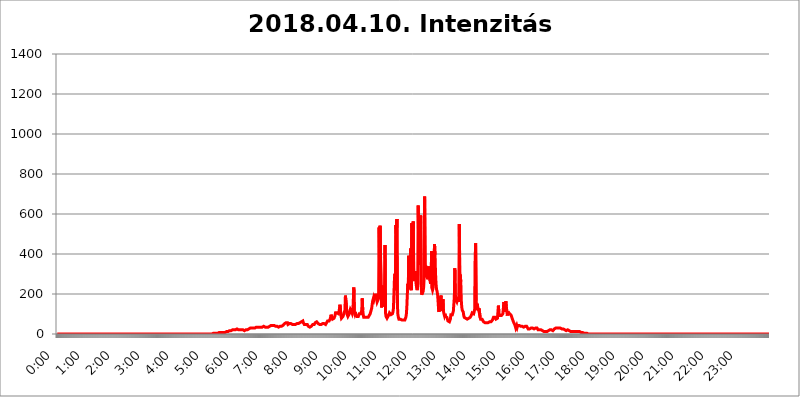
| Category | 2018.04.10. Intenzitás [W/m^2] |
|---|---|
| 0.0 | 0 |
| 0.0006944444444444445 | 0 |
| 0.001388888888888889 | 0 |
| 0.0020833333333333333 | 0 |
| 0.002777777777777778 | 0 |
| 0.003472222222222222 | 0 |
| 0.004166666666666667 | 0 |
| 0.004861111111111111 | 0 |
| 0.005555555555555556 | 0 |
| 0.0062499999999999995 | 0 |
| 0.006944444444444444 | 0 |
| 0.007638888888888889 | 0 |
| 0.008333333333333333 | 0 |
| 0.009027777777777779 | 0 |
| 0.009722222222222222 | 0 |
| 0.010416666666666666 | 0 |
| 0.011111111111111112 | 0 |
| 0.011805555555555555 | 0 |
| 0.012499999999999999 | 0 |
| 0.013194444444444444 | 0 |
| 0.013888888888888888 | 0 |
| 0.014583333333333332 | 0 |
| 0.015277777777777777 | 0 |
| 0.015972222222222224 | 0 |
| 0.016666666666666666 | 0 |
| 0.017361111111111112 | 0 |
| 0.018055555555555557 | 0 |
| 0.01875 | 0 |
| 0.019444444444444445 | 0 |
| 0.02013888888888889 | 0 |
| 0.020833333333333332 | 0 |
| 0.02152777777777778 | 0 |
| 0.022222222222222223 | 0 |
| 0.02291666666666667 | 0 |
| 0.02361111111111111 | 0 |
| 0.024305555555555556 | 0 |
| 0.024999999999999998 | 0 |
| 0.025694444444444447 | 0 |
| 0.02638888888888889 | 0 |
| 0.027083333333333334 | 0 |
| 0.027777777777777776 | 0 |
| 0.02847222222222222 | 0 |
| 0.029166666666666664 | 0 |
| 0.029861111111111113 | 0 |
| 0.030555555555555555 | 0 |
| 0.03125 | 0 |
| 0.03194444444444445 | 0 |
| 0.03263888888888889 | 0 |
| 0.03333333333333333 | 0 |
| 0.034027777777777775 | 0 |
| 0.034722222222222224 | 0 |
| 0.035416666666666666 | 0 |
| 0.036111111111111115 | 0 |
| 0.03680555555555556 | 0 |
| 0.0375 | 0 |
| 0.03819444444444444 | 0 |
| 0.03888888888888889 | 0 |
| 0.03958333333333333 | 0 |
| 0.04027777777777778 | 0 |
| 0.04097222222222222 | 0 |
| 0.041666666666666664 | 0 |
| 0.042361111111111106 | 0 |
| 0.04305555555555556 | 0 |
| 0.043750000000000004 | 0 |
| 0.044444444444444446 | 0 |
| 0.04513888888888889 | 0 |
| 0.04583333333333334 | 0 |
| 0.04652777777777778 | 0 |
| 0.04722222222222222 | 0 |
| 0.04791666666666666 | 0 |
| 0.04861111111111111 | 0 |
| 0.049305555555555554 | 0 |
| 0.049999999999999996 | 0 |
| 0.05069444444444445 | 0 |
| 0.051388888888888894 | 0 |
| 0.052083333333333336 | 0 |
| 0.05277777777777778 | 0 |
| 0.05347222222222222 | 0 |
| 0.05416666666666667 | 0 |
| 0.05486111111111111 | 0 |
| 0.05555555555555555 | 0 |
| 0.05625 | 0 |
| 0.05694444444444444 | 0 |
| 0.057638888888888885 | 0 |
| 0.05833333333333333 | 0 |
| 0.05902777777777778 | 0 |
| 0.059722222222222225 | 0 |
| 0.06041666666666667 | 0 |
| 0.061111111111111116 | 0 |
| 0.06180555555555556 | 0 |
| 0.0625 | 0 |
| 0.06319444444444444 | 0 |
| 0.06388888888888888 | 0 |
| 0.06458333333333334 | 0 |
| 0.06527777777777778 | 0 |
| 0.06597222222222222 | 0 |
| 0.06666666666666667 | 0 |
| 0.06736111111111111 | 0 |
| 0.06805555555555555 | 0 |
| 0.06874999999999999 | 0 |
| 0.06944444444444443 | 0 |
| 0.07013888888888889 | 0 |
| 0.07083333333333333 | 0 |
| 0.07152777777777779 | 0 |
| 0.07222222222222223 | 0 |
| 0.07291666666666667 | 0 |
| 0.07361111111111111 | 0 |
| 0.07430555555555556 | 0 |
| 0.075 | 0 |
| 0.07569444444444444 | 0 |
| 0.0763888888888889 | 0 |
| 0.07708333333333334 | 0 |
| 0.07777777777777778 | 0 |
| 0.07847222222222222 | 0 |
| 0.07916666666666666 | 0 |
| 0.0798611111111111 | 0 |
| 0.08055555555555556 | 0 |
| 0.08125 | 0 |
| 0.08194444444444444 | 0 |
| 0.08263888888888889 | 0 |
| 0.08333333333333333 | 0 |
| 0.08402777777777777 | 0 |
| 0.08472222222222221 | 0 |
| 0.08541666666666665 | 0 |
| 0.08611111111111112 | 0 |
| 0.08680555555555557 | 0 |
| 0.08750000000000001 | 0 |
| 0.08819444444444445 | 0 |
| 0.08888888888888889 | 0 |
| 0.08958333333333333 | 0 |
| 0.09027777777777778 | 0 |
| 0.09097222222222222 | 0 |
| 0.09166666666666667 | 0 |
| 0.09236111111111112 | 0 |
| 0.09305555555555556 | 0 |
| 0.09375 | 0 |
| 0.09444444444444444 | 0 |
| 0.09513888888888888 | 0 |
| 0.09583333333333333 | 0 |
| 0.09652777777777777 | 0 |
| 0.09722222222222222 | 0 |
| 0.09791666666666667 | 0 |
| 0.09861111111111111 | 0 |
| 0.09930555555555555 | 0 |
| 0.09999999999999999 | 0 |
| 0.10069444444444443 | 0 |
| 0.1013888888888889 | 0 |
| 0.10208333333333335 | 0 |
| 0.10277777777777779 | 0 |
| 0.10347222222222223 | 0 |
| 0.10416666666666667 | 0 |
| 0.10486111111111111 | 0 |
| 0.10555555555555556 | 0 |
| 0.10625 | 0 |
| 0.10694444444444444 | 0 |
| 0.1076388888888889 | 0 |
| 0.10833333333333334 | 0 |
| 0.10902777777777778 | 0 |
| 0.10972222222222222 | 0 |
| 0.1111111111111111 | 0 |
| 0.11180555555555556 | 0 |
| 0.11180555555555556 | 0 |
| 0.1125 | 0 |
| 0.11319444444444444 | 0 |
| 0.11388888888888889 | 0 |
| 0.11458333333333333 | 0 |
| 0.11527777777777777 | 0 |
| 0.11597222222222221 | 0 |
| 0.11666666666666665 | 0 |
| 0.1173611111111111 | 0 |
| 0.11805555555555557 | 0 |
| 0.11944444444444445 | 0 |
| 0.12013888888888889 | 0 |
| 0.12083333333333333 | 0 |
| 0.12152777777777778 | 0 |
| 0.12222222222222223 | 0 |
| 0.12291666666666667 | 0 |
| 0.12291666666666667 | 0 |
| 0.12361111111111112 | 0 |
| 0.12430555555555556 | 0 |
| 0.125 | 0 |
| 0.12569444444444444 | 0 |
| 0.12638888888888888 | 0 |
| 0.12708333333333333 | 0 |
| 0.16875 | 0 |
| 0.12847222222222224 | 0 |
| 0.12916666666666668 | 0 |
| 0.12986111111111112 | 0 |
| 0.13055555555555556 | 0 |
| 0.13125 | 0 |
| 0.13194444444444445 | 0 |
| 0.1326388888888889 | 0 |
| 0.13333333333333333 | 0 |
| 0.13402777777777777 | 0 |
| 0.13402777777777777 | 0 |
| 0.13472222222222222 | 0 |
| 0.13541666666666666 | 0 |
| 0.1361111111111111 | 0 |
| 0.13749999999999998 | 0 |
| 0.13819444444444443 | 0 |
| 0.1388888888888889 | 0 |
| 0.13958333333333334 | 0 |
| 0.14027777777777778 | 0 |
| 0.14097222222222222 | 0 |
| 0.14166666666666666 | 0 |
| 0.1423611111111111 | 0 |
| 0.14305555555555557 | 0 |
| 0.14375000000000002 | 0 |
| 0.14444444444444446 | 0 |
| 0.1451388888888889 | 0 |
| 0.1451388888888889 | 0 |
| 0.14652777777777778 | 0 |
| 0.14722222222222223 | 0 |
| 0.14791666666666667 | 0 |
| 0.1486111111111111 | 0 |
| 0.14930555555555555 | 0 |
| 0.15 | 0 |
| 0.15069444444444444 | 0 |
| 0.15138888888888888 | 0 |
| 0.15208333333333332 | 0 |
| 0.15277777777777776 | 0 |
| 0.15347222222222223 | 0 |
| 0.15416666666666667 | 0 |
| 0.15486111111111112 | 0 |
| 0.15555555555555556 | 0 |
| 0.15625 | 0 |
| 0.15694444444444444 | 0 |
| 0.15763888888888888 | 0 |
| 0.15833333333333333 | 0 |
| 0.15902777777777777 | 0 |
| 0.15972222222222224 | 0 |
| 0.16041666666666668 | 0 |
| 0.16111111111111112 | 0 |
| 0.16180555555555556 | 0 |
| 0.1625 | 0 |
| 0.16319444444444445 | 0 |
| 0.1638888888888889 | 0 |
| 0.16458333333333333 | 0 |
| 0.16527777777777777 | 0 |
| 0.16597222222222222 | 0 |
| 0.16666666666666666 | 0 |
| 0.1673611111111111 | 0 |
| 0.16805555555555554 | 0 |
| 0.16874999999999998 | 0 |
| 0.16944444444444443 | 0 |
| 0.17013888888888887 | 0 |
| 0.1708333333333333 | 0 |
| 0.17152777777777775 | 0 |
| 0.17222222222222225 | 0 |
| 0.1729166666666667 | 0 |
| 0.17361111111111113 | 0 |
| 0.17430555555555557 | 0 |
| 0.17500000000000002 | 0 |
| 0.17569444444444446 | 0 |
| 0.1763888888888889 | 0 |
| 0.17708333333333334 | 0 |
| 0.17777777777777778 | 0 |
| 0.17847222222222223 | 0 |
| 0.17916666666666667 | 0 |
| 0.1798611111111111 | 0 |
| 0.18055555555555555 | 0 |
| 0.18125 | 0 |
| 0.18194444444444444 | 0 |
| 0.1826388888888889 | 0 |
| 0.18333333333333335 | 0 |
| 0.1840277777777778 | 0 |
| 0.18472222222222223 | 0 |
| 0.18541666666666667 | 0 |
| 0.18611111111111112 | 0 |
| 0.18680555555555556 | 0 |
| 0.1875 | 0 |
| 0.18819444444444444 | 0 |
| 0.18888888888888888 | 0 |
| 0.18958333333333333 | 0 |
| 0.19027777777777777 | 0 |
| 0.1909722222222222 | 0 |
| 0.19166666666666665 | 0 |
| 0.19236111111111112 | 0 |
| 0.19305555555555554 | 0 |
| 0.19375 | 0 |
| 0.19444444444444445 | 0 |
| 0.1951388888888889 | 0 |
| 0.19583333333333333 | 0 |
| 0.19652777777777777 | 0 |
| 0.19722222222222222 | 0 |
| 0.19791666666666666 | 0 |
| 0.1986111111111111 | 0 |
| 0.19930555555555554 | 0 |
| 0.19999999999999998 | 0 |
| 0.20069444444444443 | 0 |
| 0.20138888888888887 | 0 |
| 0.2020833333333333 | 0 |
| 0.2027777777777778 | 0 |
| 0.2034722222222222 | 0 |
| 0.2041666666666667 | 0 |
| 0.20486111111111113 | 0 |
| 0.20555555555555557 | 0 |
| 0.20625000000000002 | 0 |
| 0.20694444444444446 | 0 |
| 0.2076388888888889 | 0 |
| 0.20833333333333334 | 0 |
| 0.20902777777777778 | 0 |
| 0.20972222222222223 | 0 |
| 0.21041666666666667 | 0 |
| 0.2111111111111111 | 0 |
| 0.21180555555555555 | 0 |
| 0.2125 | 0 |
| 0.21319444444444444 | 0 |
| 0.2138888888888889 | 0 |
| 0.21458333333333335 | 0 |
| 0.2152777777777778 | 0 |
| 0.21597222222222223 | 0 |
| 0.21666666666666667 | 0 |
| 0.21736111111111112 | 0 |
| 0.21805555555555556 | 3.525 |
| 0.21875 | 3.525 |
| 0.21944444444444444 | 3.525 |
| 0.22013888888888888 | 3.525 |
| 0.22083333333333333 | 3.525 |
| 0.22152777777777777 | 3.525 |
| 0.2222222222222222 | 3.525 |
| 0.22291666666666665 | 3.525 |
| 0.2236111111111111 | 3.525 |
| 0.22430555555555556 | 3.525 |
| 0.225 | 3.525 |
| 0.22569444444444445 | 3.525 |
| 0.2263888888888889 | 3.525 |
| 0.22708333333333333 | 7.887 |
| 0.22777777777777777 | 3.525 |
| 0.22847222222222222 | 7.887 |
| 0.22916666666666666 | 7.887 |
| 0.2298611111111111 | 7.887 |
| 0.23055555555555554 | 7.887 |
| 0.23124999999999998 | 7.887 |
| 0.23194444444444443 | 7.887 |
| 0.23263888888888887 | 7.887 |
| 0.2333333333333333 | 7.887 |
| 0.2340277777777778 | 7.887 |
| 0.2347222222222222 | 12.257 |
| 0.2354166666666667 | 7.887 |
| 0.23611111111111113 | 7.887 |
| 0.23680555555555557 | 12.257 |
| 0.23750000000000002 | 12.257 |
| 0.23819444444444446 | 12.257 |
| 0.2388888888888889 | 12.257 |
| 0.23958333333333334 | 12.257 |
| 0.24027777777777778 | 12.257 |
| 0.24097222222222223 | 12.257 |
| 0.24166666666666667 | 16.636 |
| 0.2423611111111111 | 16.636 |
| 0.24305555555555555 | 16.636 |
| 0.24375 | 16.636 |
| 0.24444444444444446 | 16.636 |
| 0.24513888888888888 | 21.024 |
| 0.24583333333333335 | 21.024 |
| 0.2465277777777778 | 21.024 |
| 0.24722222222222223 | 21.024 |
| 0.24791666666666667 | 21.024 |
| 0.24861111111111112 | 21.024 |
| 0.24930555555555556 | 21.024 |
| 0.25 | 21.024 |
| 0.25069444444444444 | 21.024 |
| 0.2513888888888889 | 21.024 |
| 0.2520833333333333 | 25.419 |
| 0.25277777777777777 | 21.024 |
| 0.2534722222222222 | 21.024 |
| 0.25416666666666665 | 21.024 |
| 0.2548611111111111 | 21.024 |
| 0.2555555555555556 | 21.024 |
| 0.25625000000000003 | 21.024 |
| 0.2569444444444445 | 21.024 |
| 0.2576388888888889 | 21.024 |
| 0.25833333333333336 | 21.024 |
| 0.2590277777777778 | 21.024 |
| 0.25972222222222224 | 21.024 |
| 0.2604166666666667 | 21.024 |
| 0.2611111111111111 | 21.024 |
| 0.26180555555555557 | 16.636 |
| 0.2625 | 16.636 |
| 0.26319444444444445 | 21.024 |
| 0.2638888888888889 | 16.636 |
| 0.26458333333333334 | 21.024 |
| 0.2652777777777778 | 21.024 |
| 0.2659722222222222 | 21.024 |
| 0.26666666666666666 | 21.024 |
| 0.2673611111111111 | 21.024 |
| 0.26805555555555555 | 25.419 |
| 0.26875 | 25.419 |
| 0.26944444444444443 | 25.419 |
| 0.2701388888888889 | 29.823 |
| 0.2708333333333333 | 29.823 |
| 0.27152777777777776 | 29.823 |
| 0.2722222222222222 | 29.823 |
| 0.27291666666666664 | 29.823 |
| 0.2736111111111111 | 29.823 |
| 0.2743055555555555 | 29.823 |
| 0.27499999999999997 | 29.823 |
| 0.27569444444444446 | 29.823 |
| 0.27638888888888885 | 29.823 |
| 0.27708333333333335 | 29.823 |
| 0.2777777777777778 | 29.823 |
| 0.27847222222222223 | 29.823 |
| 0.2791666666666667 | 34.234 |
| 0.2798611111111111 | 29.823 |
| 0.28055555555555556 | 34.234 |
| 0.28125 | 34.234 |
| 0.28194444444444444 | 34.234 |
| 0.2826388888888889 | 34.234 |
| 0.2833333333333333 | 34.234 |
| 0.28402777777777777 | 34.234 |
| 0.2847222222222222 | 34.234 |
| 0.28541666666666665 | 34.234 |
| 0.28611111111111115 | 34.234 |
| 0.28680555555555554 | 34.234 |
| 0.28750000000000003 | 34.234 |
| 0.2881944444444445 | 38.653 |
| 0.2888888888888889 | 38.653 |
| 0.28958333333333336 | 38.653 |
| 0.2902777777777778 | 38.653 |
| 0.29097222222222224 | 38.653 |
| 0.2916666666666667 | 34.234 |
| 0.2923611111111111 | 34.234 |
| 0.29305555555555557 | 34.234 |
| 0.29375 | 34.234 |
| 0.29444444444444445 | 34.234 |
| 0.2951388888888889 | 34.234 |
| 0.29583333333333334 | 34.234 |
| 0.2965277777777778 | 34.234 |
| 0.2972222222222222 | 34.234 |
| 0.29791666666666666 | 38.653 |
| 0.2986111111111111 | 38.653 |
| 0.29930555555555555 | 38.653 |
| 0.3 | 43.079 |
| 0.30069444444444443 | 43.079 |
| 0.3013888888888889 | 43.079 |
| 0.3020833333333333 | 43.079 |
| 0.30277777777777776 | 43.079 |
| 0.3034722222222222 | 43.079 |
| 0.30416666666666664 | 43.079 |
| 0.3048611111111111 | 38.653 |
| 0.3055555555555555 | 38.653 |
| 0.30624999999999997 | 38.653 |
| 0.3069444444444444 | 38.653 |
| 0.3076388888888889 | 38.653 |
| 0.30833333333333335 | 38.653 |
| 0.3090277777777778 | 38.653 |
| 0.30972222222222223 | 34.234 |
| 0.3104166666666667 | 34.234 |
| 0.3111111111111111 | 34.234 |
| 0.31180555555555556 | 34.234 |
| 0.3125 | 38.653 |
| 0.31319444444444444 | 38.653 |
| 0.3138888888888889 | 38.653 |
| 0.3145833333333333 | 38.653 |
| 0.31527777777777777 | 38.653 |
| 0.3159722222222222 | 43.079 |
| 0.31666666666666665 | 43.079 |
| 0.31736111111111115 | 47.511 |
| 0.31805555555555554 | 47.511 |
| 0.31875000000000003 | 51.951 |
| 0.3194444444444445 | 51.951 |
| 0.3201388888888889 | 51.951 |
| 0.32083333333333336 | 56.398 |
| 0.3215277777777778 | 51.951 |
| 0.32222222222222224 | 51.951 |
| 0.3229166666666667 | 56.398 |
| 0.3236111111111111 | 47.511 |
| 0.32430555555555557 | 47.511 |
| 0.325 | 47.511 |
| 0.32569444444444445 | 51.951 |
| 0.3263888888888889 | 51.951 |
| 0.32708333333333334 | 51.951 |
| 0.3277777777777778 | 51.951 |
| 0.3284722222222222 | 51.951 |
| 0.32916666666666666 | 51.951 |
| 0.3298611111111111 | 47.511 |
| 0.33055555555555555 | 47.511 |
| 0.33125 | 47.511 |
| 0.33194444444444443 | 47.511 |
| 0.3326388888888889 | 47.511 |
| 0.3333333333333333 | 47.511 |
| 0.3340277777777778 | 47.511 |
| 0.3347222222222222 | 47.511 |
| 0.3354166666666667 | 51.951 |
| 0.3361111111111111 | 51.951 |
| 0.3368055555555556 | 51.951 |
| 0.33749999999999997 | 51.951 |
| 0.33819444444444446 | 51.951 |
| 0.33888888888888885 | 56.398 |
| 0.33958333333333335 | 56.398 |
| 0.34027777777777773 | 56.398 |
| 0.34097222222222223 | 56.398 |
| 0.3416666666666666 | 60.85 |
| 0.3423611111111111 | 60.85 |
| 0.3430555555555555 | 60.85 |
| 0.34375 | 60.85 |
| 0.3444444444444445 | 65.31 |
| 0.3451388888888889 | 56.398 |
| 0.3458333333333334 | 51.951 |
| 0.34652777777777777 | 47.511 |
| 0.34722222222222227 | 47.511 |
| 0.34791666666666665 | 47.511 |
| 0.34861111111111115 | 47.511 |
| 0.34930555555555554 | 47.511 |
| 0.35000000000000003 | 47.511 |
| 0.3506944444444444 | 47.511 |
| 0.3513888888888889 | 43.079 |
| 0.3520833333333333 | 38.653 |
| 0.3527777777777778 | 34.234 |
| 0.3534722222222222 | 34.234 |
| 0.3541666666666667 | 34.234 |
| 0.3548611111111111 | 34.234 |
| 0.35555555555555557 | 38.653 |
| 0.35625 | 38.653 |
| 0.35694444444444445 | 38.653 |
| 0.3576388888888889 | 43.079 |
| 0.35833333333333334 | 47.511 |
| 0.3590277777777778 | 47.511 |
| 0.3597222222222222 | 47.511 |
| 0.36041666666666666 | 47.511 |
| 0.3611111111111111 | 51.951 |
| 0.36180555555555555 | 56.398 |
| 0.3625 | 60.85 |
| 0.36319444444444443 | 60.85 |
| 0.3638888888888889 | 60.85 |
| 0.3645833333333333 | 60.85 |
| 0.3652777777777778 | 56.398 |
| 0.3659722222222222 | 51.951 |
| 0.3666666666666667 | 47.511 |
| 0.3673611111111111 | 47.511 |
| 0.3680555555555556 | 47.511 |
| 0.36874999999999997 | 47.511 |
| 0.36944444444444446 | 47.511 |
| 0.37013888888888885 | 47.511 |
| 0.37083333333333335 | 51.951 |
| 0.37152777777777773 | 51.951 |
| 0.37222222222222223 | 51.951 |
| 0.3729166666666666 | 51.951 |
| 0.3736111111111111 | 51.951 |
| 0.3743055555555555 | 51.951 |
| 0.375 | 51.951 |
| 0.3756944444444445 | 47.511 |
| 0.3763888888888889 | 47.511 |
| 0.3770833333333334 | 51.951 |
| 0.37777777777777777 | 56.398 |
| 0.37847222222222227 | 60.85 |
| 0.37916666666666665 | 65.31 |
| 0.37986111111111115 | 65.31 |
| 0.38055555555555554 | 65.31 |
| 0.38125000000000003 | 65.31 |
| 0.3819444444444444 | 69.775 |
| 0.3826388888888889 | 74.246 |
| 0.3833333333333333 | 83.205 |
| 0.3840277777777778 | 96.682 |
| 0.3847222222222222 | 87.692 |
| 0.3854166666666667 | 83.205 |
| 0.3861111111111111 | 74.246 |
| 0.38680555555555557 | 74.246 |
| 0.3875 | 74.246 |
| 0.38819444444444445 | 78.722 |
| 0.3888888888888889 | 83.205 |
| 0.38958333333333334 | 92.184 |
| 0.3902777777777778 | 105.69 |
| 0.3909722222222222 | 101.184 |
| 0.39166666666666666 | 101.184 |
| 0.3923611111111111 | 105.69 |
| 0.39305555555555555 | 105.69 |
| 0.39375 | 101.184 |
| 0.39444444444444443 | 101.184 |
| 0.3951388888888889 | 110.201 |
| 0.3958333333333333 | 128.284 |
| 0.3965277777777778 | 146.423 |
| 0.3972222222222222 | 123.758 |
| 0.3979166666666667 | 92.184 |
| 0.3986111111111111 | 78.722 |
| 0.3993055555555556 | 74.246 |
| 0.39999999999999997 | 78.722 |
| 0.40069444444444446 | 87.692 |
| 0.40138888888888885 | 92.184 |
| 0.40208333333333335 | 101.184 |
| 0.40277777777777773 | 110.201 |
| 0.40347222222222223 | 119.235 |
| 0.4041666666666666 | 191.937 |
| 0.4048611111111111 | 196.497 |
| 0.4055555555555555 | 141.884 |
| 0.40625 | 101.184 |
| 0.4069444444444445 | 101.184 |
| 0.4076388888888889 | 87.692 |
| 0.4083333333333334 | 87.692 |
| 0.40902777777777777 | 92.184 |
| 0.40972222222222227 | 101.184 |
| 0.41041666666666665 | 114.716 |
| 0.41111111111111115 | 123.758 |
| 0.41180555555555554 | 119.235 |
| 0.41250000000000003 | 114.716 |
| 0.4131944444444444 | 110.201 |
| 0.4138888888888889 | 101.184 |
| 0.4145833333333333 | 110.201 |
| 0.4152777777777778 | 114.716 |
| 0.4159722222222222 | 233 |
| 0.4166666666666667 | 110.201 |
| 0.4173611111111111 | 101.184 |
| 0.41805555555555557 | 110.201 |
| 0.41875 | 96.682 |
| 0.41944444444444445 | 92.184 |
| 0.4201388888888889 | 87.692 |
| 0.42083333333333334 | 83.205 |
| 0.4215277777777778 | 83.205 |
| 0.4222222222222222 | 87.692 |
| 0.42291666666666666 | 92.184 |
| 0.4236111111111111 | 101.184 |
| 0.42430555555555555 | 101.184 |
| 0.425 | 101.184 |
| 0.42569444444444443 | 101.184 |
| 0.4263888888888889 | 105.69 |
| 0.4270833333333333 | 119.235 |
| 0.4277777777777778 | 178.264 |
| 0.4284722222222222 | 119.235 |
| 0.4291666666666667 | 96.682 |
| 0.4298611111111111 | 83.205 |
| 0.4305555555555556 | 83.205 |
| 0.43124999999999997 | 83.205 |
| 0.43194444444444446 | 83.205 |
| 0.43263888888888885 | 83.205 |
| 0.43333333333333335 | 83.205 |
| 0.43402777777777773 | 83.205 |
| 0.43472222222222223 | 83.205 |
| 0.4354166666666666 | 83.205 |
| 0.4361111111111111 | 83.205 |
| 0.4368055555555555 | 83.205 |
| 0.4375 | 92.184 |
| 0.4381944444444445 | 96.682 |
| 0.4388888888888889 | 101.184 |
| 0.4395833333333334 | 110.201 |
| 0.44027777777777777 | 119.235 |
| 0.44097222222222227 | 128.284 |
| 0.44166666666666665 | 146.423 |
| 0.44236111111111115 | 164.605 |
| 0.44305555555555554 | 160.056 |
| 0.44375000000000003 | 182.82 |
| 0.4444444444444444 | 173.709 |
| 0.4451388888888889 | 173.709 |
| 0.4458333333333333 | 191.937 |
| 0.4465277777777778 | 201.058 |
| 0.4472222222222222 | 182.82 |
| 0.4479166666666667 | 173.709 |
| 0.4486111111111111 | 160.056 |
| 0.44930555555555557 | 160.056 |
| 0.45 | 164.605 |
| 0.45069444444444445 | 178.264 |
| 0.4513888888888889 | 532.513 |
| 0.45208333333333334 | 342.162 |
| 0.4527777777777778 | 541.121 |
| 0.4534722222222222 | 378.224 |
| 0.45416666666666666 | 301.354 |
| 0.4548611111111111 | 132.814 |
| 0.45555555555555555 | 173.709 |
| 0.45625 | 191.937 |
| 0.45694444444444443 | 228.436 |
| 0.4576388888888889 | 242.127 |
| 0.4583333333333333 | 137.347 |
| 0.4590277777777778 | 228.436 |
| 0.4597222222222222 | 445.129 |
| 0.4604166666666667 | 105.69 |
| 0.4611111111111111 | 87.692 |
| 0.4618055555555556 | 83.205 |
| 0.46249999999999997 | 78.722 |
| 0.46319444444444446 | 83.205 |
| 0.46388888888888885 | 83.205 |
| 0.46458333333333335 | 92.184 |
| 0.46527777777777773 | 96.682 |
| 0.46597222222222223 | 105.69 |
| 0.4666666666666666 | 105.69 |
| 0.4673611111111111 | 101.184 |
| 0.4680555555555555 | 96.682 |
| 0.46875 | 92.184 |
| 0.4694444444444445 | 96.682 |
| 0.4701388888888889 | 101.184 |
| 0.4708333333333334 | 110.201 |
| 0.47152777777777777 | 128.284 |
| 0.47222222222222227 | 201.058 |
| 0.47291666666666665 | 274.047 |
| 0.47361111111111115 | 301.354 |
| 0.47430555555555554 | 219.309 |
| 0.47500000000000003 | 545.416 |
| 0.4756944444444444 | 497.836 |
| 0.4763888888888889 | 575.299 |
| 0.4770833333333333 | 146.423 |
| 0.4777777777777778 | 96.682 |
| 0.4784722222222222 | 83.205 |
| 0.4791666666666667 | 74.246 |
| 0.4798611111111111 | 74.246 |
| 0.48055555555555557 | 69.775 |
| 0.48125 | 74.246 |
| 0.48194444444444445 | 69.775 |
| 0.4826388888888889 | 69.775 |
| 0.48333333333333334 | 69.775 |
| 0.4840277777777778 | 69.775 |
| 0.4847222222222222 | 69.775 |
| 0.48541666666666666 | 69.775 |
| 0.4861111111111111 | 69.775 |
| 0.48680555555555555 | 69.775 |
| 0.4875 | 69.775 |
| 0.48819444444444443 | 74.246 |
| 0.4888888888888889 | 83.205 |
| 0.4895833333333333 | 96.682 |
| 0.4902777777777778 | 132.814 |
| 0.4909722222222222 | 196.497 |
| 0.4916666666666667 | 251.251 |
| 0.4923611111111111 | 223.873 |
| 0.4930555555555556 | 391.685 |
| 0.49374999999999997 | 328.584 |
| 0.49444444444444446 | 328.584 |
| 0.49513888888888885 | 287.709 |
| 0.49583333333333335 | 427.39 |
| 0.49652777777777773 | 219.309 |
| 0.49722222222222223 | 553.986 |
| 0.4979166666666666 | 553.986 |
| 0.4986111111111111 | 515.223 |
| 0.4993055555555555 | 562.53 |
| 0.5 | 283.156 |
| 0.5006944444444444 | 278.603 |
| 0.5013888888888889 | 264.932 |
| 0.5020833333333333 | 314.98 |
| 0.5027777777777778 | 269.49 |
| 0.5034722222222222 | 246.689 |
| 0.5041666666666667 | 228.436 |
| 0.5048611111111111 | 219.309 |
| 0.5055555555555555 | 242.127 |
| 0.50625 | 642.4 |
| 0.5069444444444444 | 431.833 |
| 0.5076388888888889 | 562.53 |
| 0.5083333333333333 | 391.685 |
| 0.5090277777777777 | 346.682 |
| 0.5097222222222222 | 592.233 |
| 0.5104166666666666 | 246.689 |
| 0.5111111111111112 | 196.497 |
| 0.5118055555555555 | 191.937 |
| 0.5125000000000001 | 196.497 |
| 0.5131944444444444 | 214.746 |
| 0.513888888888889 | 233 |
| 0.5145833333333333 | 283.156 |
| 0.5152777777777778 | 687.544 |
| 0.5159722222222222 | 333.113 |
| 0.5166666666666667 | 342.162 |
| 0.517361111111111 | 310.44 |
| 0.5180555555555556 | 283.156 |
| 0.5187499999999999 | 314.98 |
| 0.5194444444444445 | 274.047 |
| 0.5201388888888888 | 274.047 |
| 0.5208333333333334 | 337.639 |
| 0.5215277777777778 | 301.354 |
| 0.5222222222222223 | 310.44 |
| 0.5229166666666667 | 264.932 |
| 0.5236111111111111 | 251.251 |
| 0.5243055555555556 | 274.047 |
| 0.525 | 414.035 |
| 0.5256944444444445 | 228.436 |
| 0.5263888888888889 | 219.309 |
| 0.5270833333333333 | 228.436 |
| 0.5277777777777778 | 251.251 |
| 0.5284722222222222 | 382.715 |
| 0.5291666666666667 | 449.551 |
| 0.5298611111111111 | 396.164 |
| 0.5305555555555556 | 301.354 |
| 0.53125 | 251.251 |
| 0.5319444444444444 | 223.873 |
| 0.5326388888888889 | 214.746 |
| 0.5333333333333333 | 201.058 |
| 0.5340277777777778 | 169.156 |
| 0.5347222222222222 | 128.284 |
| 0.5354166666666667 | 110.201 |
| 0.5361111111111111 | 173.709 |
| 0.5368055555555555 | 119.235 |
| 0.5375 | 119.235 |
| 0.5381944444444444 | 191.937 |
| 0.5388888888888889 | 123.758 |
| 0.5395833333333333 | 114.716 |
| 0.5402777777777777 | 114.716 |
| 0.5409722222222222 | 173.709 |
| 0.5416666666666666 | 114.716 |
| 0.5423611111111112 | 101.184 |
| 0.5430555555555555 | 92.184 |
| 0.5437500000000001 | 101.184 |
| 0.5444444444444444 | 87.692 |
| 0.545138888888889 | 87.692 |
| 0.5458333333333333 | 83.205 |
| 0.5465277777777778 | 83.205 |
| 0.5472222222222222 | 74.246 |
| 0.5479166666666667 | 65.31 |
| 0.548611111111111 | 65.31 |
| 0.5493055555555556 | 60.85 |
| 0.5499999999999999 | 60.85 |
| 0.5506944444444445 | 65.31 |
| 0.5513888888888888 | 74.246 |
| 0.5520833333333334 | 96.682 |
| 0.5527777777777778 | 96.682 |
| 0.5534722222222223 | 92.184 |
| 0.5541666666666667 | 96.682 |
| 0.5548611111111111 | 105.69 |
| 0.5555555555555556 | 114.716 |
| 0.55625 | 119.235 |
| 0.5569444444444445 | 187.378 |
| 0.5576388888888889 | 328.584 |
| 0.5583333333333333 | 196.497 |
| 0.5590277777777778 | 169.156 |
| 0.5597222222222222 | 164.605 |
| 0.5604166666666667 | 160.056 |
| 0.5611111111111111 | 169.156 |
| 0.5618055555555556 | 182.82 |
| 0.5625 | 160.056 |
| 0.5631944444444444 | 187.378 |
| 0.5638888888888889 | 549.704 |
| 0.5645833333333333 | 274.047 |
| 0.5652777777777778 | 296.808 |
| 0.5659722222222222 | 260.373 |
| 0.5666666666666667 | 169.156 |
| 0.5673611111111111 | 132.814 |
| 0.5680555555555555 | 119.235 |
| 0.56875 | 119.235 |
| 0.5694444444444444 | 110.201 |
| 0.5701388888888889 | 92.184 |
| 0.5708333333333333 | 83.205 |
| 0.5715277777777777 | 78.722 |
| 0.5722222222222222 | 78.722 |
| 0.5729166666666666 | 78.722 |
| 0.5736111111111112 | 74.246 |
| 0.5743055555555555 | 74.246 |
| 0.5750000000000001 | 74.246 |
| 0.5756944444444444 | 74.246 |
| 0.576388888888889 | 78.722 |
| 0.5770833333333333 | 78.722 |
| 0.5777777777777778 | 83.205 |
| 0.5784722222222222 | 83.205 |
| 0.5791666666666667 | 83.205 |
| 0.579861111111111 | 87.692 |
| 0.5805555555555556 | 92.184 |
| 0.5812499999999999 | 96.682 |
| 0.5819444444444445 | 105.69 |
| 0.5826388888888888 | 110.201 |
| 0.5833333333333334 | 101.184 |
| 0.5840277777777778 | 101.184 |
| 0.5847222222222223 | 110.201 |
| 0.5854166666666667 | 123.758 |
| 0.5861111111111111 | 373.729 |
| 0.5868055555555556 | 453.968 |
| 0.5875 | 169.156 |
| 0.5881944444444445 | 137.347 |
| 0.5888888888888889 | 150.964 |
| 0.5895833333333333 | 119.235 |
| 0.5902777777777778 | 128.284 |
| 0.5909722222222222 | 119.235 |
| 0.5916666666666667 | 128.284 |
| 0.5923611111111111 | 123.758 |
| 0.5930555555555556 | 83.205 |
| 0.59375 | 74.246 |
| 0.5944444444444444 | 74.246 |
| 0.5951388888888889 | 78.722 |
| 0.5958333333333333 | 74.246 |
| 0.5965277777777778 | 78.722 |
| 0.5972222222222222 | 69.775 |
| 0.5979166666666667 | 60.85 |
| 0.5986111111111111 | 56.398 |
| 0.5993055555555555 | 56.398 |
| 0.6 | 56.398 |
| 0.6006944444444444 | 56.398 |
| 0.6013888888888889 | 56.398 |
| 0.6020833333333333 | 56.398 |
| 0.6027777777777777 | 56.398 |
| 0.6034722222222222 | 56.398 |
| 0.6041666666666666 | 56.398 |
| 0.6048611111111112 | 56.398 |
| 0.6055555555555555 | 56.398 |
| 0.6062500000000001 | 60.85 |
| 0.6069444444444444 | 60.85 |
| 0.607638888888889 | 60.85 |
| 0.6083333333333333 | 60.85 |
| 0.6090277777777778 | 60.85 |
| 0.6097222222222222 | 65.31 |
| 0.6104166666666667 | 69.775 |
| 0.611111111111111 | 74.246 |
| 0.6118055555555556 | 83.205 |
| 0.6124999999999999 | 87.692 |
| 0.6131944444444445 | 83.205 |
| 0.6138888888888888 | 83.205 |
| 0.6145833333333334 | 78.722 |
| 0.6152777777777778 | 74.246 |
| 0.6159722222222223 | 74.246 |
| 0.6166666666666667 | 74.246 |
| 0.6173611111111111 | 78.722 |
| 0.6180555555555556 | 83.205 |
| 0.61875 | 141.884 |
| 0.6194444444444445 | 101.184 |
| 0.6201388888888889 | 96.682 |
| 0.6208333333333333 | 92.184 |
| 0.6215277777777778 | 92.184 |
| 0.6222222222222222 | 87.692 |
| 0.6229166666666667 | 92.184 |
| 0.6236111111111111 | 92.184 |
| 0.6243055555555556 | 92.184 |
| 0.625 | 101.184 |
| 0.6256944444444444 | 128.284 |
| 0.6263888888888889 | 160.056 |
| 0.6270833333333333 | 110.201 |
| 0.6277777777777778 | 110.201 |
| 0.6284722222222222 | 146.423 |
| 0.6291666666666667 | 164.605 |
| 0.6298611111111111 | 137.347 |
| 0.6305555555555555 | 141.884 |
| 0.63125 | 92.184 |
| 0.6319444444444444 | 114.716 |
| 0.6326388888888889 | 105.69 |
| 0.6333333333333333 | 101.184 |
| 0.6340277777777777 | 101.184 |
| 0.6347222222222222 | 101.184 |
| 0.6354166666666666 | 101.184 |
| 0.6361111111111112 | 96.682 |
| 0.6368055555555555 | 92.184 |
| 0.6375000000000001 | 83.205 |
| 0.6381944444444444 | 78.722 |
| 0.638888888888889 | 69.775 |
| 0.6395833333333333 | 65.31 |
| 0.6402777777777778 | 56.398 |
| 0.6409722222222222 | 51.951 |
| 0.6416666666666667 | 47.511 |
| 0.642361111111111 | 47.511 |
| 0.6430555555555556 | 29.823 |
| 0.6437499999999999 | 25.419 |
| 0.6444444444444445 | 43.079 |
| 0.6451388888888888 | 34.234 |
| 0.6458333333333334 | 43.079 |
| 0.6465277777777778 | 43.079 |
| 0.6472222222222223 | 38.653 |
| 0.6479166666666667 | 43.079 |
| 0.6486111111111111 | 43.079 |
| 0.6493055555555556 | 38.653 |
| 0.65 | 38.653 |
| 0.6506944444444445 | 38.653 |
| 0.6513888888888889 | 38.653 |
| 0.6520833333333333 | 38.653 |
| 0.6527777777777778 | 38.653 |
| 0.6534722222222222 | 38.653 |
| 0.6541666666666667 | 34.234 |
| 0.6548611111111111 | 34.234 |
| 0.6555555555555556 | 38.653 |
| 0.65625 | 38.653 |
| 0.6569444444444444 | 38.653 |
| 0.6576388888888889 | 38.653 |
| 0.6583333333333333 | 38.653 |
| 0.6590277777777778 | 38.653 |
| 0.6597222222222222 | 38.653 |
| 0.6604166666666667 | 25.419 |
| 0.6611111111111111 | 25.419 |
| 0.6618055555555555 | 25.419 |
| 0.6625 | 25.419 |
| 0.6631944444444444 | 29.823 |
| 0.6638888888888889 | 29.823 |
| 0.6645833333333333 | 29.823 |
| 0.6652777777777777 | 29.823 |
| 0.6659722222222222 | 29.823 |
| 0.6666666666666666 | 29.823 |
| 0.6673611111111111 | 34.234 |
| 0.6680555555555556 | 29.823 |
| 0.6687500000000001 | 25.419 |
| 0.6694444444444444 | 25.419 |
| 0.6701388888888888 | 29.823 |
| 0.6708333333333334 | 29.823 |
| 0.6715277777777778 | 29.823 |
| 0.6722222222222222 | 29.823 |
| 0.6729166666666666 | 29.823 |
| 0.6736111111111112 | 25.419 |
| 0.6743055555555556 | 21.024 |
| 0.6749999999999999 | 21.024 |
| 0.6756944444444444 | 21.024 |
| 0.6763888888888889 | 21.024 |
| 0.6770833333333334 | 21.024 |
| 0.6777777777777777 | 21.024 |
| 0.6784722222222223 | 21.024 |
| 0.6791666666666667 | 21.024 |
| 0.6798611111111111 | 16.636 |
| 0.6805555555555555 | 16.636 |
| 0.68125 | 16.636 |
| 0.6819444444444445 | 16.636 |
| 0.6826388888888889 | 12.257 |
| 0.6833333333333332 | 12.257 |
| 0.6840277777777778 | 12.257 |
| 0.6847222222222222 | 12.257 |
| 0.6854166666666667 | 12.257 |
| 0.686111111111111 | 12.257 |
| 0.6868055555555556 | 12.257 |
| 0.6875 | 12.257 |
| 0.6881944444444444 | 16.636 |
| 0.688888888888889 | 16.636 |
| 0.6895833333333333 | 16.636 |
| 0.6902777777777778 | 16.636 |
| 0.6909722222222222 | 21.024 |
| 0.6916666666666668 | 21.024 |
| 0.6923611111111111 | 21.024 |
| 0.6930555555555555 | 21.024 |
| 0.69375 | 16.636 |
| 0.6944444444444445 | 16.636 |
| 0.6951388888888889 | 16.636 |
| 0.6958333333333333 | 16.636 |
| 0.6965277777777777 | 21.024 |
| 0.6972222222222223 | 25.419 |
| 0.6979166666666666 | 29.823 |
| 0.6986111111111111 | 29.823 |
| 0.6993055555555556 | 29.823 |
| 0.7000000000000001 | 29.823 |
| 0.7006944444444444 | 29.823 |
| 0.7013888888888888 | 29.823 |
| 0.7020833333333334 | 34.234 |
| 0.7027777777777778 | 34.234 |
| 0.7034722222222222 | 29.823 |
| 0.7041666666666666 | 29.823 |
| 0.7048611111111112 | 29.823 |
| 0.7055555555555556 | 29.823 |
| 0.7062499999999999 | 29.823 |
| 0.7069444444444444 | 29.823 |
| 0.7076388888888889 | 25.419 |
| 0.7083333333333334 | 25.419 |
| 0.7090277777777777 | 25.419 |
| 0.7097222222222223 | 25.419 |
| 0.7104166666666667 | 21.024 |
| 0.7111111111111111 | 21.024 |
| 0.7118055555555555 | 21.024 |
| 0.7125 | 16.636 |
| 0.7131944444444445 | 21.024 |
| 0.7138888888888889 | 16.636 |
| 0.7145833333333332 | 16.636 |
| 0.7152777777777778 | 21.024 |
| 0.7159722222222222 | 21.024 |
| 0.7166666666666667 | 16.636 |
| 0.717361111111111 | 16.636 |
| 0.7180555555555556 | 16.636 |
| 0.71875 | 12.257 |
| 0.7194444444444444 | 12.257 |
| 0.720138888888889 | 12.257 |
| 0.7208333333333333 | 12.257 |
| 0.7215277777777778 | 12.257 |
| 0.7222222222222222 | 12.257 |
| 0.7229166666666668 | 12.257 |
| 0.7236111111111111 | 12.257 |
| 0.7243055555555555 | 12.257 |
| 0.725 | 12.257 |
| 0.7256944444444445 | 12.257 |
| 0.7263888888888889 | 12.257 |
| 0.7270833333333333 | 12.257 |
| 0.7277777777777777 | 12.257 |
| 0.7284722222222223 | 12.257 |
| 0.7291666666666666 | 12.257 |
| 0.7298611111111111 | 12.257 |
| 0.7305555555555556 | 12.257 |
| 0.7312500000000001 | 12.257 |
| 0.7319444444444444 | 12.257 |
| 0.7326388888888888 | 12.257 |
| 0.7333333333333334 | 7.887 |
| 0.7340277777777778 | 7.887 |
| 0.7347222222222222 | 7.887 |
| 0.7354166666666666 | 7.887 |
| 0.7361111111111112 | 7.887 |
| 0.7368055555555556 | 7.887 |
| 0.7374999999999999 | 7.887 |
| 0.7381944444444444 | 3.525 |
| 0.7388888888888889 | 3.525 |
| 0.7395833333333334 | 3.525 |
| 0.7402777777777777 | 3.525 |
| 0.7409722222222223 | 3.525 |
| 0.7416666666666667 | 3.525 |
| 0.7423611111111111 | 3.525 |
| 0.7430555555555555 | 3.525 |
| 0.74375 | 0 |
| 0.7444444444444445 | 0 |
| 0.7451388888888889 | 0 |
| 0.7458333333333332 | 0 |
| 0.7465277777777778 | 0 |
| 0.7472222222222222 | 0 |
| 0.7479166666666667 | 0 |
| 0.748611111111111 | 0 |
| 0.7493055555555556 | 0 |
| 0.75 | 0 |
| 0.7506944444444444 | 0 |
| 0.751388888888889 | 0 |
| 0.7520833333333333 | 0 |
| 0.7527777777777778 | 0 |
| 0.7534722222222222 | 0 |
| 0.7541666666666668 | 0 |
| 0.7548611111111111 | 0 |
| 0.7555555555555555 | 0 |
| 0.75625 | 0 |
| 0.7569444444444445 | 0 |
| 0.7576388888888889 | 0 |
| 0.7583333333333333 | 0 |
| 0.7590277777777777 | 0 |
| 0.7597222222222223 | 0 |
| 0.7604166666666666 | 0 |
| 0.7611111111111111 | 0 |
| 0.7618055555555556 | 0 |
| 0.7625000000000001 | 0 |
| 0.7631944444444444 | 0 |
| 0.7638888888888888 | 0 |
| 0.7645833333333334 | 0 |
| 0.7652777777777778 | 0 |
| 0.7659722222222222 | 0 |
| 0.7666666666666666 | 0 |
| 0.7673611111111112 | 0 |
| 0.7680555555555556 | 0 |
| 0.7687499999999999 | 0 |
| 0.7694444444444444 | 0 |
| 0.7701388888888889 | 0 |
| 0.7708333333333334 | 0 |
| 0.7715277777777777 | 0 |
| 0.7722222222222223 | 0 |
| 0.7729166666666667 | 0 |
| 0.7736111111111111 | 0 |
| 0.7743055555555555 | 0 |
| 0.775 | 0 |
| 0.7756944444444445 | 0 |
| 0.7763888888888889 | 0 |
| 0.7770833333333332 | 0 |
| 0.7777777777777778 | 0 |
| 0.7784722222222222 | 0 |
| 0.7791666666666667 | 0 |
| 0.779861111111111 | 0 |
| 0.7805555555555556 | 0 |
| 0.78125 | 0 |
| 0.7819444444444444 | 0 |
| 0.782638888888889 | 0 |
| 0.7833333333333333 | 0 |
| 0.7840277777777778 | 0 |
| 0.7847222222222222 | 0 |
| 0.7854166666666668 | 0 |
| 0.7861111111111111 | 0 |
| 0.7868055555555555 | 0 |
| 0.7875 | 0 |
| 0.7881944444444445 | 0 |
| 0.7888888888888889 | 0 |
| 0.7895833333333333 | 0 |
| 0.7902777777777777 | 0 |
| 0.7909722222222223 | 0 |
| 0.7916666666666666 | 0 |
| 0.7923611111111111 | 0 |
| 0.7930555555555556 | 0 |
| 0.7937500000000001 | 0 |
| 0.7944444444444444 | 0 |
| 0.7951388888888888 | 0 |
| 0.7958333333333334 | 0 |
| 0.7965277777777778 | 0 |
| 0.7972222222222222 | 0 |
| 0.7979166666666666 | 0 |
| 0.7986111111111112 | 0 |
| 0.7993055555555556 | 0 |
| 0.7999999999999999 | 0 |
| 0.8006944444444444 | 0 |
| 0.8013888888888889 | 0 |
| 0.8020833333333334 | 0 |
| 0.8027777777777777 | 0 |
| 0.8034722222222223 | 0 |
| 0.8041666666666667 | 0 |
| 0.8048611111111111 | 0 |
| 0.8055555555555555 | 0 |
| 0.80625 | 0 |
| 0.8069444444444445 | 0 |
| 0.8076388888888889 | 0 |
| 0.8083333333333332 | 0 |
| 0.8090277777777778 | 0 |
| 0.8097222222222222 | 0 |
| 0.8104166666666667 | 0 |
| 0.811111111111111 | 0 |
| 0.8118055555555556 | 0 |
| 0.8125 | 0 |
| 0.8131944444444444 | 0 |
| 0.813888888888889 | 0 |
| 0.8145833333333333 | 0 |
| 0.8152777777777778 | 0 |
| 0.8159722222222222 | 0 |
| 0.8166666666666668 | 0 |
| 0.8173611111111111 | 0 |
| 0.8180555555555555 | 0 |
| 0.81875 | 0 |
| 0.8194444444444445 | 0 |
| 0.8201388888888889 | 0 |
| 0.8208333333333333 | 0 |
| 0.8215277777777777 | 0 |
| 0.8222222222222223 | 0 |
| 0.8229166666666666 | 0 |
| 0.8236111111111111 | 0 |
| 0.8243055555555556 | 0 |
| 0.8250000000000001 | 0 |
| 0.8256944444444444 | 0 |
| 0.8263888888888888 | 0 |
| 0.8270833333333334 | 0 |
| 0.8277777777777778 | 0 |
| 0.8284722222222222 | 0 |
| 0.8291666666666666 | 0 |
| 0.8298611111111112 | 0 |
| 0.8305555555555556 | 0 |
| 0.8312499999999999 | 0 |
| 0.8319444444444444 | 0 |
| 0.8326388888888889 | 0 |
| 0.8333333333333334 | 0 |
| 0.8340277777777777 | 0 |
| 0.8347222222222223 | 0 |
| 0.8354166666666667 | 0 |
| 0.8361111111111111 | 0 |
| 0.8368055555555555 | 0 |
| 0.8375 | 0 |
| 0.8381944444444445 | 0 |
| 0.8388888888888889 | 0 |
| 0.8395833333333332 | 0 |
| 0.8402777777777778 | 0 |
| 0.8409722222222222 | 0 |
| 0.8416666666666667 | 0 |
| 0.842361111111111 | 0 |
| 0.8430555555555556 | 0 |
| 0.84375 | 0 |
| 0.8444444444444444 | 0 |
| 0.845138888888889 | 0 |
| 0.8458333333333333 | 0 |
| 0.8465277777777778 | 0 |
| 0.8472222222222222 | 0 |
| 0.8479166666666668 | 0 |
| 0.8486111111111111 | 0 |
| 0.8493055555555555 | 0 |
| 0.85 | 0 |
| 0.8506944444444445 | 0 |
| 0.8513888888888889 | 0 |
| 0.8520833333333333 | 0 |
| 0.8527777777777777 | 0 |
| 0.8534722222222223 | 0 |
| 0.8541666666666666 | 0 |
| 0.8548611111111111 | 0 |
| 0.8555555555555556 | 0 |
| 0.8562500000000001 | 0 |
| 0.8569444444444444 | 0 |
| 0.8576388888888888 | 0 |
| 0.8583333333333334 | 0 |
| 0.8590277777777778 | 0 |
| 0.8597222222222222 | 0 |
| 0.8604166666666666 | 0 |
| 0.8611111111111112 | 0 |
| 0.8618055555555556 | 0 |
| 0.8624999999999999 | 0 |
| 0.8631944444444444 | 0 |
| 0.8638888888888889 | 0 |
| 0.8645833333333334 | 0 |
| 0.8652777777777777 | 0 |
| 0.8659722222222223 | 0 |
| 0.8666666666666667 | 0 |
| 0.8673611111111111 | 0 |
| 0.8680555555555555 | 0 |
| 0.86875 | 0 |
| 0.8694444444444445 | 0 |
| 0.8701388888888889 | 0 |
| 0.8708333333333332 | 0 |
| 0.8715277777777778 | 0 |
| 0.8722222222222222 | 0 |
| 0.8729166666666667 | 0 |
| 0.873611111111111 | 0 |
| 0.8743055555555556 | 0 |
| 0.875 | 0 |
| 0.8756944444444444 | 0 |
| 0.876388888888889 | 0 |
| 0.8770833333333333 | 0 |
| 0.8777777777777778 | 0 |
| 0.8784722222222222 | 0 |
| 0.8791666666666668 | 0 |
| 0.8798611111111111 | 0 |
| 0.8805555555555555 | 0 |
| 0.88125 | 0 |
| 0.8819444444444445 | 0 |
| 0.8826388888888889 | 0 |
| 0.8833333333333333 | 0 |
| 0.8840277777777777 | 0 |
| 0.8847222222222223 | 0 |
| 0.8854166666666666 | 0 |
| 0.8861111111111111 | 0 |
| 0.8868055555555556 | 0 |
| 0.8875000000000001 | 0 |
| 0.8881944444444444 | 0 |
| 0.8888888888888888 | 0 |
| 0.8895833333333334 | 0 |
| 0.8902777777777778 | 0 |
| 0.8909722222222222 | 0 |
| 0.8916666666666666 | 0 |
| 0.8923611111111112 | 0 |
| 0.8930555555555556 | 0 |
| 0.8937499999999999 | 0 |
| 0.8944444444444444 | 0 |
| 0.8951388888888889 | 0 |
| 0.8958333333333334 | 0 |
| 0.8965277777777777 | 0 |
| 0.8972222222222223 | 0 |
| 0.8979166666666667 | 0 |
| 0.8986111111111111 | 0 |
| 0.8993055555555555 | 0 |
| 0.9 | 0 |
| 0.9006944444444445 | 0 |
| 0.9013888888888889 | 0 |
| 0.9020833333333332 | 0 |
| 0.9027777777777778 | 0 |
| 0.9034722222222222 | 0 |
| 0.9041666666666667 | 0 |
| 0.904861111111111 | 0 |
| 0.9055555555555556 | 0 |
| 0.90625 | 0 |
| 0.9069444444444444 | 0 |
| 0.907638888888889 | 0 |
| 0.9083333333333333 | 0 |
| 0.9090277777777778 | 0 |
| 0.9097222222222222 | 0 |
| 0.9104166666666668 | 0 |
| 0.9111111111111111 | 0 |
| 0.9118055555555555 | 0 |
| 0.9125 | 0 |
| 0.9131944444444445 | 0 |
| 0.9138888888888889 | 0 |
| 0.9145833333333333 | 0 |
| 0.9152777777777777 | 0 |
| 0.9159722222222223 | 0 |
| 0.9166666666666666 | 0 |
| 0.9173611111111111 | 0 |
| 0.9180555555555556 | 0 |
| 0.9187500000000001 | 0 |
| 0.9194444444444444 | 0 |
| 0.9201388888888888 | 0 |
| 0.9208333333333334 | 0 |
| 0.9215277777777778 | 0 |
| 0.9222222222222222 | 0 |
| 0.9229166666666666 | 0 |
| 0.9236111111111112 | 0 |
| 0.9243055555555556 | 0 |
| 0.9249999999999999 | 0 |
| 0.9256944444444444 | 0 |
| 0.9263888888888889 | 0 |
| 0.9270833333333334 | 0 |
| 0.9277777777777777 | 0 |
| 0.9284722222222223 | 0 |
| 0.9291666666666667 | 0 |
| 0.9298611111111111 | 0 |
| 0.9305555555555555 | 0 |
| 0.93125 | 0 |
| 0.9319444444444445 | 0 |
| 0.9326388888888889 | 0 |
| 0.9333333333333332 | 0 |
| 0.9340277777777778 | 0 |
| 0.9347222222222222 | 0 |
| 0.9354166666666667 | 0 |
| 0.936111111111111 | 0 |
| 0.9368055555555556 | 0 |
| 0.9375 | 0 |
| 0.9381944444444444 | 0 |
| 0.938888888888889 | 0 |
| 0.9395833333333333 | 0 |
| 0.9402777777777778 | 0 |
| 0.9409722222222222 | 0 |
| 0.9416666666666668 | 0 |
| 0.9423611111111111 | 0 |
| 0.9430555555555555 | 0 |
| 0.94375 | 0 |
| 0.9444444444444445 | 0 |
| 0.9451388888888889 | 0 |
| 0.9458333333333333 | 0 |
| 0.9465277777777777 | 0 |
| 0.9472222222222223 | 0 |
| 0.9479166666666666 | 0 |
| 0.9486111111111111 | 0 |
| 0.9493055555555556 | 0 |
| 0.9500000000000001 | 0 |
| 0.9506944444444444 | 0 |
| 0.9513888888888888 | 0 |
| 0.9520833333333334 | 0 |
| 0.9527777777777778 | 0 |
| 0.9534722222222222 | 0 |
| 0.9541666666666666 | 0 |
| 0.9548611111111112 | 0 |
| 0.9555555555555556 | 0 |
| 0.9562499999999999 | 0 |
| 0.9569444444444444 | 0 |
| 0.9576388888888889 | 0 |
| 0.9583333333333334 | 0 |
| 0.9590277777777777 | 0 |
| 0.9597222222222223 | 0 |
| 0.9604166666666667 | 0 |
| 0.9611111111111111 | 0 |
| 0.9618055555555555 | 0 |
| 0.9625 | 0 |
| 0.9631944444444445 | 0 |
| 0.9638888888888889 | 0 |
| 0.9645833333333332 | 0 |
| 0.9652777777777778 | 0 |
| 0.9659722222222222 | 0 |
| 0.9666666666666667 | 0 |
| 0.967361111111111 | 0 |
| 0.9680555555555556 | 0 |
| 0.96875 | 0 |
| 0.9694444444444444 | 0 |
| 0.970138888888889 | 0 |
| 0.9708333333333333 | 0 |
| 0.9715277777777778 | 0 |
| 0.9722222222222222 | 0 |
| 0.9729166666666668 | 0 |
| 0.9736111111111111 | 0 |
| 0.9743055555555555 | 0 |
| 0.975 | 0 |
| 0.9756944444444445 | 0 |
| 0.9763888888888889 | 0 |
| 0.9770833333333333 | 0 |
| 0.9777777777777777 | 0 |
| 0.9784722222222223 | 0 |
| 0.9791666666666666 | 0 |
| 0.9798611111111111 | 0 |
| 0.9805555555555556 | 0 |
| 0.9812500000000001 | 0 |
| 0.9819444444444444 | 0 |
| 0.9826388888888888 | 0 |
| 0.9833333333333334 | 0 |
| 0.9840277777777778 | 0 |
| 0.9847222222222222 | 0 |
| 0.9854166666666666 | 0 |
| 0.9861111111111112 | 0 |
| 0.9868055555555556 | 0 |
| 0.9874999999999999 | 0 |
| 0.9881944444444444 | 0 |
| 0.9888888888888889 | 0 |
| 0.9895833333333334 | 0 |
| 0.9902777777777777 | 0 |
| 0.9909722222222223 | 0 |
| 0.9916666666666667 | 0 |
| 0.9923611111111111 | 0 |
| 0.9930555555555555 | 0 |
| 0.99375 | 0 |
| 0.9944444444444445 | 0 |
| 0.9951388888888889 | 0 |
| 0.9958333333333332 | 0 |
| 0.9965277777777778 | 0 |
| 0.9972222222222222 | 0 |
| 0.9979166666666667 | 0 |
| 0.998611111111111 | 0 |
| 0.9993055555555556 | 0 |